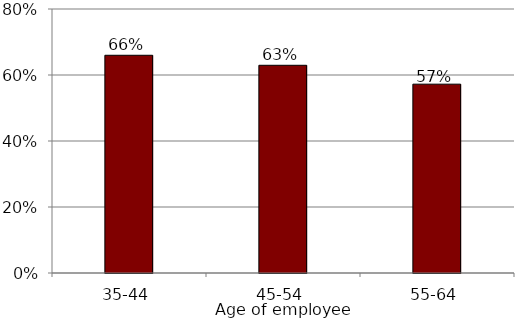
| Category | Series 0 |
|---|---|
| 35-44 | 0.66 |
| 45-54 | 0.629 |
| 55-64 | 0.572 |